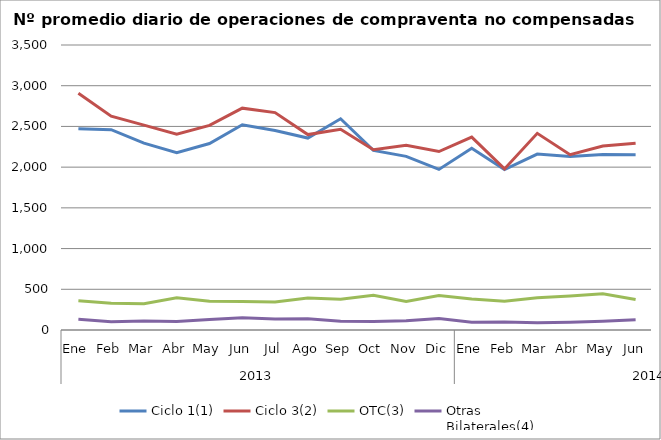
| Category | Ciclo 1(1) | Ciclo 3(2) | OTC(3) | Otras
Bilaterales(4) |
|---|---|---|---|---|
| 0 | 2472.091 | 2907.273 | 357.864 | 131.409 |
| 1 | 2459.8 | 2626.25 | 327.5 | 100.6 |
| 2 | 2294.6 | 2516 | 323.75 | 111.65 |
| 3 | 2176.182 | 2403.364 | 394.818 | 103.364 |
| 4 | 2290.048 | 2512.714 | 352.095 | 130.143 |
| 5 | 2520.75 | 2724.25 | 349.7 | 151.05 |
| 6 | 2449.045 | 2670.182 | 344.818 | 134.5 |
| 7 | 2357.333 | 2400.048 | 392.524 | 137.571 |
| 8 | 2593.778 | 2465 | 376.889 | 108.389 |
| 9 | 2205.955 | 2213.318 | 425.318 | 105.636 |
| 10 | 2132.1 | 2268.1 | 350 | 113.75 |
| 11 | 1972.35 | 2191.55 | 424.35 | 141.55 |
| 12 | 2231.227 | 2368.955 | 379.864 | 95 |
| 13 | 1969.85 | 1978.25 | 352.25 | 97.9 |
| 14 | 2160.619 | 2415.286 | 395.857 | 87.762 |
| 15 | 2130.667 | 2153.048 | 416.143 | 96 |
| 16 | 2155.9 | 2259.8 | 444.8 | 108.2 |
| 17 | 2153.571 | 2294.381 | 375.286 | 126.095 |